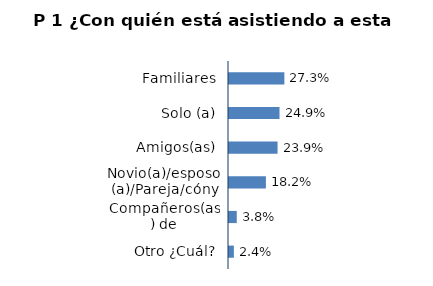
| Category | Series 0 |
|---|---|
| Familiares | 0.273 |
| Solo (a) | 0.249 |
| Amigos(as) | 0.239 |
| Novio(a)/esposo(a)/Pareja/cónyuge | 0.182 |
| Compañeros(as) de trabajo/Estudio | 0.038 |
| Otro ¿Cuál? | 0.024 |